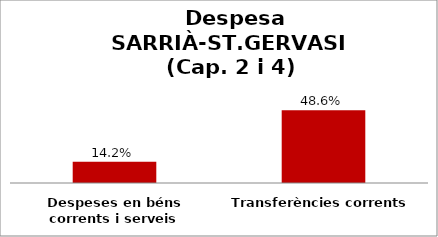
| Category | Series 0 |
|---|---|
| Despeses en béns corrents i serveis | 0.142 |
| Transferències corrents | 0.486 |